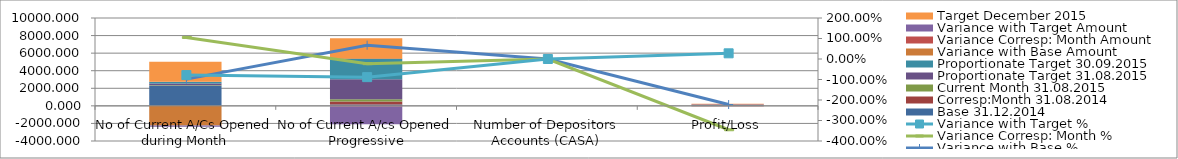
| Category | Base 31.12.2014 | Corresp:Month 31.08.2014 | Current Month 31.08.2015 | Proportionate Target 31.08.2015 | Proportionate Target 30.09.2015 | Variance with Base Amount  | Variance Corresp: Month Amount | Variance with Target Amount | Target December 2015 |
|---|---|---|---|---|---|---|---|---|---|
| No of Current A/Cs Opened during Month | 2280 | 20 | 41 | 190 | 190 | -2239 | 21 | -149 | 2280 |
| No of Current A/cs Opened Progressive | 157 | 340 | 263 | 2280 | 2280 | 106 | -77 | -2017 | 2280 |
| Number of Depositors Accounts (CASA) | 0 | 0 | 0 | 0 | 0 | 0 | 0 | 0 | 0 |
| Profit/Loss | -26.512 | -13.202 | 32.37 | 25.347 | 28.869 | 58.882 | 45.572 | 7.022 | 39.416 |